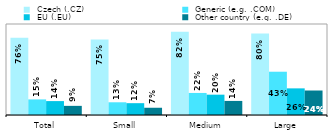
| Category |  Czech (.CZ) |  Generic (e.g. .COM) |  EU (.EU) |  Other country (e.g. .DE) |
|---|---|---|---|---|
| Total | 0.763 | 0.154 | 0.138 | 0.09 |
| Small | 0.748 | 0.126 | 0.117 | 0.072 |
| Medium | 0.823 | 0.218 | 0.201 | 0.139 |
| Large | 0.805 | 0.428 | 0.263 | 0.242 |